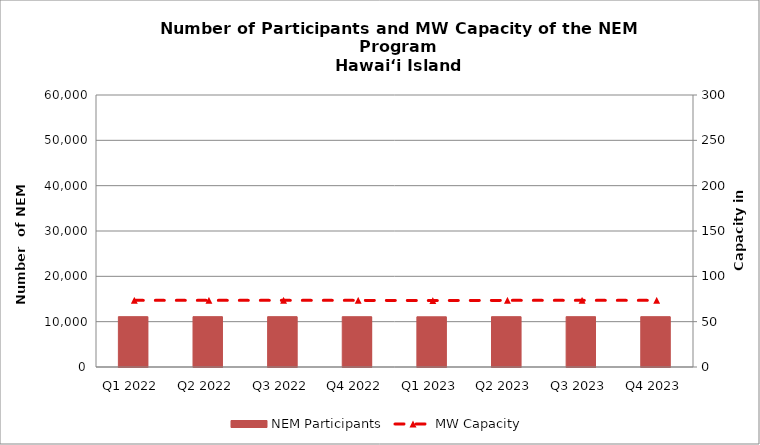
| Category | NEM Participants |
|---|---|
| Q1 2022 | 11105 |
| Q2 2022 | 11105 |
| Q3 2022 | 11103 |
| Q4 2022 | 11093 |
| Q1 2023 | 11069 |
| Q2 2023 | 11101 |
| Q3 2023 | 11101 |
| Q4 2023 | 11100 |